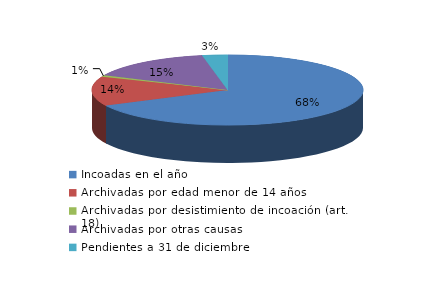
| Category | Series 0 |
|---|---|
| Incoadas en el año | 90 |
| Archivadas por edad menor de 14 años | 18 |
| Archivadas por desistimiento de incoación (art. 18) | 1 |
| Archivadas por otras causas | 20 |
| Pendientes a 31 de diciembre | 4 |